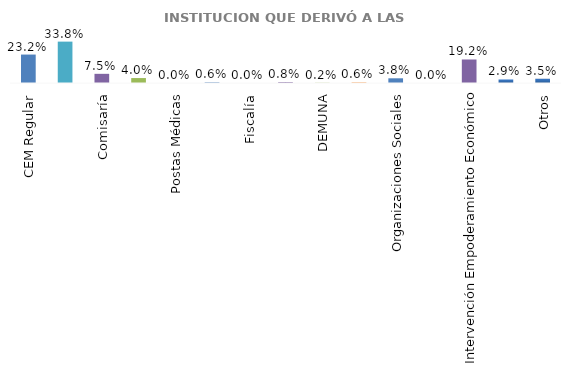
| Category | Series 0 |
|---|---|
| CEM Regular | 0.232 |
| CEM Comisaría | 0.338 |
| Comisaría | 0.075 |
| Centro de Salud | 0.04 |
| Postas Médicas | 0 |
| Hospital | 0.006 |
| Fiscalía | 0 |
| Poder Judicial | 0.008 |
| DEMUNA | 0.002 |
| Instituciones Educativas | 0.006 |
| Organizaciones Sociales | 0.038 |
| Sociedad Civil | 0 |
| Intervención Empoderamiento Económico | 0.192 |
| Intervención Comunitaria con Líderes y Lideresas de las Organizaciones | 0.029 |
| Otros | 0.035 |